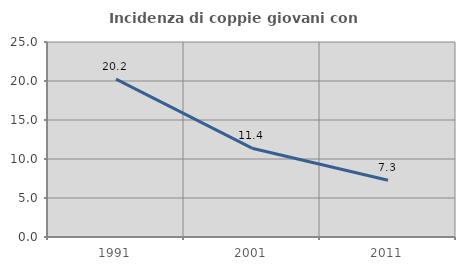
| Category | Incidenza di coppie giovani con figli |
|---|---|
| 1991.0 | 20.236 |
| 2001.0 | 11.387 |
| 2011.0 | 7.271 |